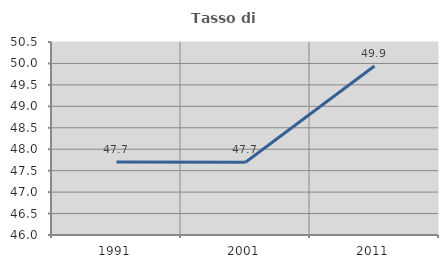
| Category | Tasso di occupazione   |
|---|---|
| 1991.0 | 47.701 |
| 2001.0 | 47.698 |
| 2011.0 | 49.94 |